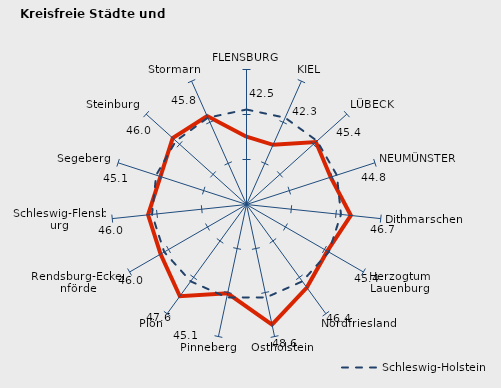
| Category | Kreise | Schleswig-Holstein |
|---|---|---|
| FLENSBURG | 42.539 | 45.554 |
| KIEL | 42.255 | 45.554 |
| LÜBECK | 45.376 | 45.554 |
| NEUMÜNSTER | 44.832 | 45.554 |
| Dithmarschen | 46.66 | 45.554 |
| Herzogtum Lauenburg | 45.368 | 45.554 |
| Nordfriesland | 46.402 | 45.554 |
| Ostholstein | 48.637 | 45.554 |
| Pinneberg | 45.086 | 45.554 |
| Plön | 47.598 | 45.554 |
| Rendsburg-Eckernförde | 46.025 | 45.554 |
| Schleswig-Flensburg | 45.998 | 45.554 |
| Segeberg | 45.057 | 45.554 |
| Steinburg | 46.034 | 45.554 |
| Stormarn | 45.753 | 45.554 |